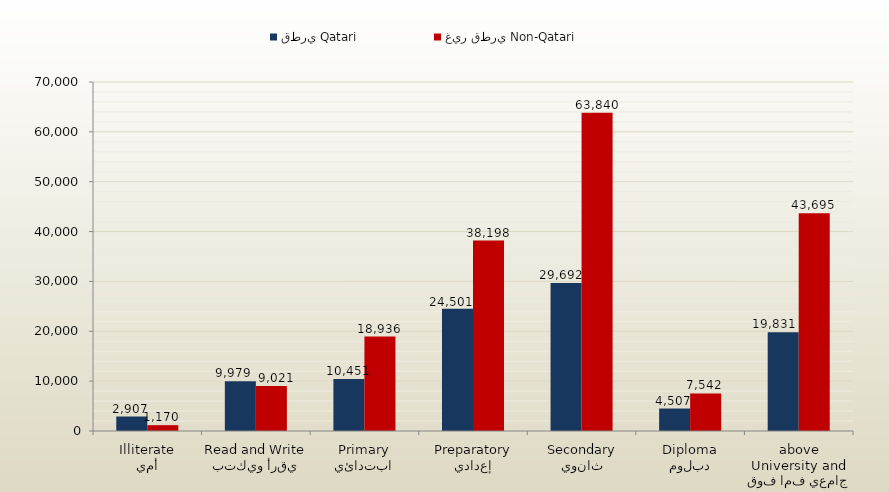
| Category | قطري Qatari | غير قطري Non-Qatari |
|---|---|---|
| أمي
Illiterate | 2907 | 1170 |
| يقرأ ويكتب
Read and Write | 9979 | 9021 |
| ابتدائي
Primary | 10451 | 18936 |
| إعدادي
Preparatory | 24501 | 38198 |
| ثانوي
Secondary | 29692 | 63840 |
| دبلوم
Diploma | 4507 | 7542 |
| جامعي فما فوق
University and above | 19831 | 43695 |